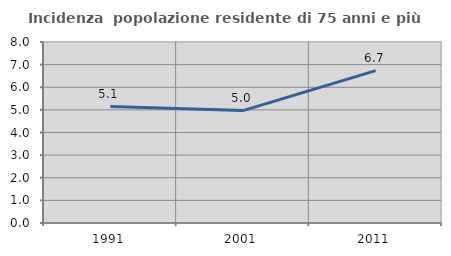
| Category | Incidenza  popolazione residente di 75 anni e più |
|---|---|
| 1991.0 | 5.147 |
| 2001.0 | 4.968 |
| 2011.0 | 6.736 |